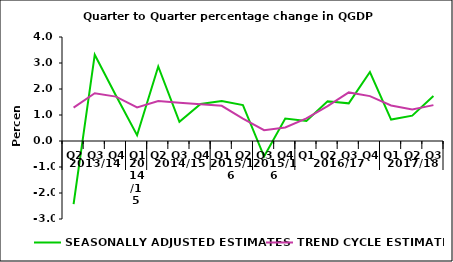
| Category | SEASONALLY ADJUSTED ESTIMATES | TREND CYCLE ESTIMATES |
|---|---|---|
| 0 | -2.428 | 1.281 |
| 1 | 3.319 | 1.836 |
| 2 | 1.752 | 1.708 |
| 3 | 0.222 | 1.293 |
| 4 | 2.865 | 1.534 |
| 5 | 0.739 | 1.47 |
| 6 | 1.423 | 1.416 |
| 7 | 1.536 | 1.353 |
| 8 | 1.383 | 0.865 |
| 9 | -0.598 | 0.415 |
| 10 | 0.86 | 0.522 |
| 11 | 0.767 | 0.866 |
| 12 | 1.529 | 1.339 |
| 13 | 1.449 | 1.869 |
| 14 | 2.651 | 1.726 |
| 15 | 0.823 | 1.368 |
| 16 | 0.976 | 1.209 |
| 17 | 1.731 | 1.379 |